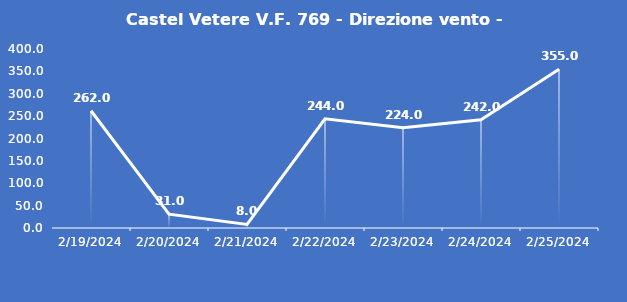
| Category | Castel Vetere V.F. 769 - Direzione vento - Grezzo (°N) |
|---|---|
| 2/19/24 | 262 |
| 2/20/24 | 31 |
| 2/21/24 | 8 |
| 2/22/24 | 244 |
| 2/23/24 | 224 |
| 2/24/24 | 242 |
| 2/25/24 | 355 |